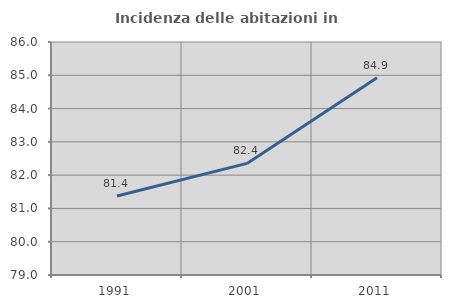
| Category | Incidenza delle abitazioni in proprietà  |
|---|---|
| 1991.0 | 81.373 |
| 2001.0 | 82.353 |
| 2011.0 | 84.925 |